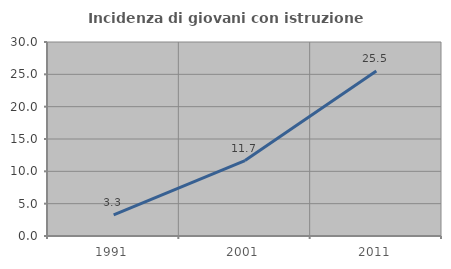
| Category | Incidenza di giovani con istruzione universitaria |
|---|---|
| 1991.0 | 3.279 |
| 2001.0 | 11.662 |
| 2011.0 | 25.524 |